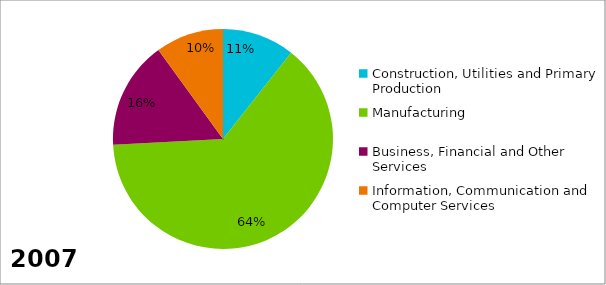
| Category | Series 0 |
|---|---|
| Construction, Utilities and Primary Production | 0.106 |
| Manufacturing | 0.635 |
| Business, Financial and Other Services | 0.158 |
| Information, Communication and Computer Services | 0.1 |